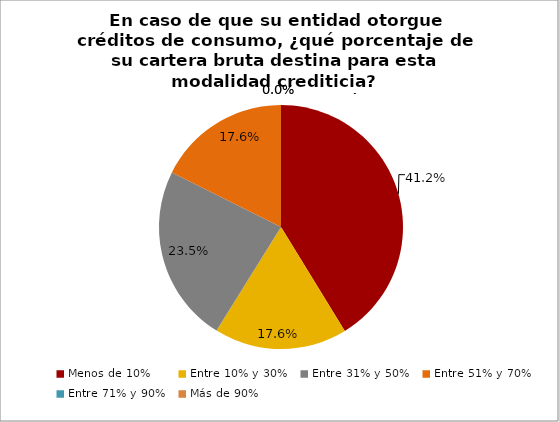
| Category | En caso de que su entidad otorgue créditos de consumo, ¿qué porcentaje de su cartera bruta destina para esta modalidad crediticia? Mercado de microcrédito |
|---|---|
| Menos de 10% | 0.412 |
| Entre 10% y 30% | 0.176 |
| Entre 31% y 50% | 0.235 |
| Entre 51% y 70% | 0.176 |
| Entre 71% y 90% | 0 |
| Más de 90% | 0 |